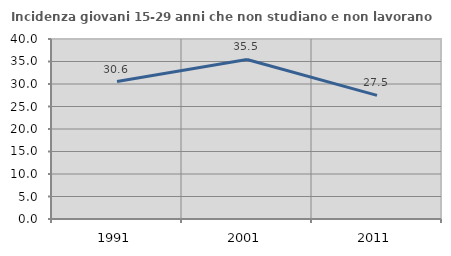
| Category | Incidenza giovani 15-29 anni che non studiano e non lavorano  |
|---|---|
| 1991.0 | 30.556 |
| 2001.0 | 35.457 |
| 2011.0 | 27.476 |